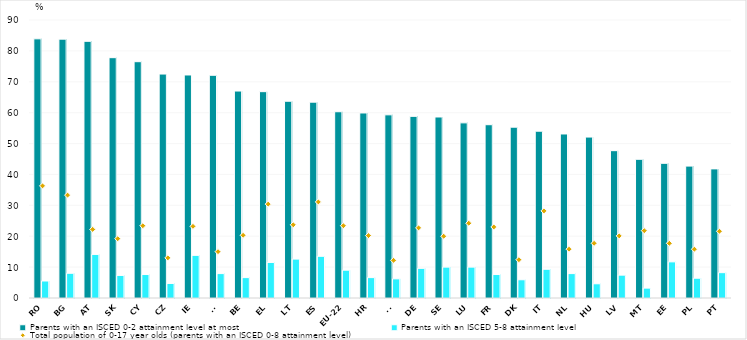
| Category | Parents with an ISCED 0-2 attainment level at most | Parents with an ISCED 5-8 attainment level |
|---|---|---|
| RO | 83.9 | 5.5 |
| BG | 83.8 | 8 |
| AT | 83.1 | 14.1 |
| SK | 77.8 | 7.3 |
| CY | 76.5 | 7.6 |
| CZ | 72.5 | 4.7 |
| IE | 72.2 | 13.8 |
| FI | 72.1 | 7.9 |
| BE | 67 | 6.6 |
| EL | 66.8 | 11.5 |
| LT | 63.7 | 12.6 |
| ES | 63.4 | 13.5 |
| EU-22 | 60.3 | 9 |
| HR | 59.9 | 6.6 |
| SI | 59.3 | 6.2 |
| DE | 58.8 | 9.6 |
| SE | 58.6 | 10 |
| LU | 56.7 | 10 |
| FR | 56.1 | 7.6 |
| DK | 55.3 | 5.9 |
| IT | 54 | 9.3 |
| NL | 53.1 | 7.9 |
| HU | 52.1 | 4.6 |
| LV | 47.7 | 7.4 |
| MT | 44.9 | 3.2 |
| EE | 43.6 | 11.7 |
| PL | 42.7 | 6.4 |
| PT | 41.8 | 8.2 |